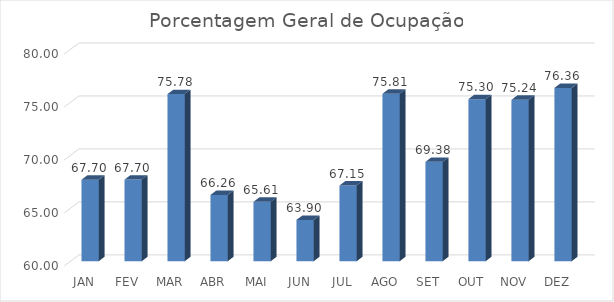
| Category | Porcentagem Geral de Ocupação |
|---|---|
|  JAN  | 67.696 |
|  FEV  | 67.704 |
|  MAR  | 75.777 |
|  ABR  | 66.256 |
|  MAI  | 65.608 |
|  JUN  | 63.897 |
|  JUL  | 67.146 |
|  AGO  | 75.806 |
|  SET  | 69.381 |
|  OUT  | 75.3 |
|  NOV  | 75.238 |
|  DEZ  | 76.359 |